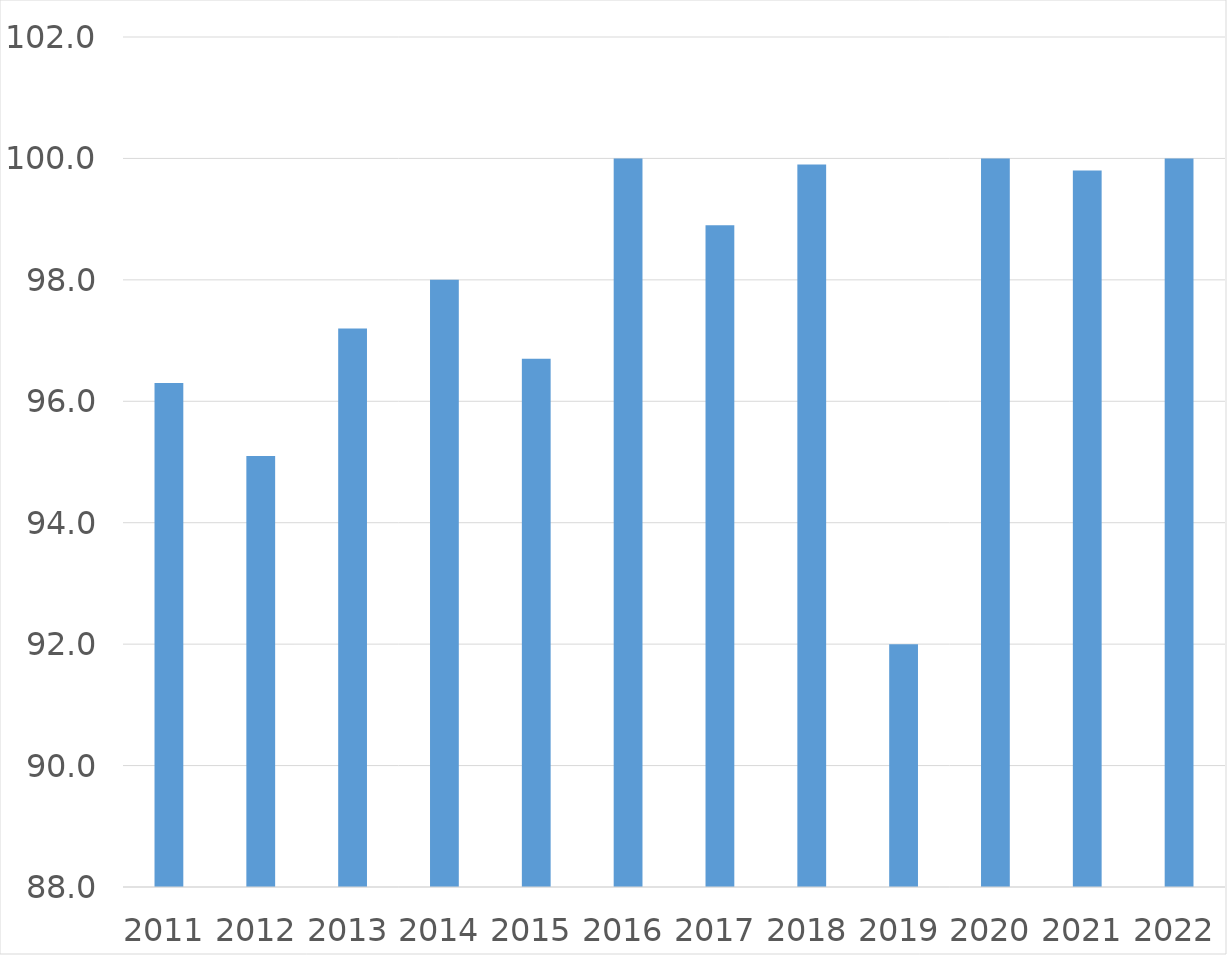
| Category | Series 0 |
|---|---|
| 2011 | 96.3 |
| 2012 | 95.1 |
| 2013 | 97.2 |
| 2014 | 98 |
| 2015 | 96.7 |
| 2016 | 100 |
| 2017 | 98.9 |
| 2018 | 99.9 |
| 2019 | 92 |
| 2020 | 100 |
| 2021 | 99.8 |
| 2022 | 100 |